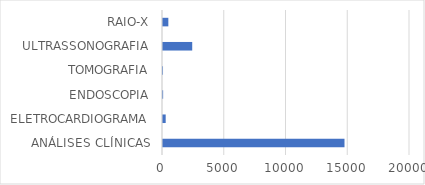
| Category | Series 0 |
|---|---|
| ANÁLISES CLÍNICAS | 14696 |
| ELETROCARDIOGRAMA | 218 |
| ENDOSCOPIA | 11 |
| TOMOGRAFIA | 1 |
| ULTRASSONOGRAFIA | 2366 |
| RAIO-X | 432 |